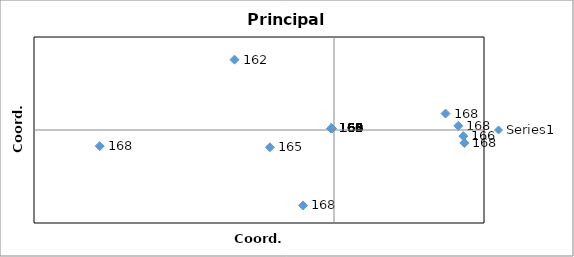
| Category | Series 0 |
|---|---|
| 0.8693510468851741 | -0.083 |
| 0.8625037532989059 | -0.04 |
| 0.8290828827029942 | 0.027 |
| 0.7436455254052227 | 0.106 |
| -0.20622155248945861 | -0.487 |
| -0.4272006790853172 | -0.112 |
| -0.662946236337818 | 0.454 |
| -1.5619629406298896 | -0.104 |
| -0.018593824989577994 | 0.01 |
| -0.018593824989597767 | 0.01 |
| -0.01859382498960576 | 0.01 |
| -0.018593824989621498 | 0.01 |
| -0.018593824989633582 | 0.01 |
| -0.018593824989645083 | 0.01 |
| -0.018593824989655994 | 0.01 |
| -0.018593824989666424 | 0.01 |
| -0.018593824989676336 | 0.01 |
| -0.018593824989685738 | 0.01 |
| -0.018593824989694696 | 0.01 |
| -0.018593824989703266 | 0.01 |
| -0.01859382498971471 | 0.01 |
| -0.018593824989723076 | 0.01 |
| -0.01859382498973114 | 0.01 |
| -0.018593824989738963 | 0.01 |
| -0.018593824989746516 | 0.01 |
| -0.01859382498959726 | 0.01 |
| -0.018593824989597232 | 0.01 |
| -0.01859382498959718 | 0.01 |
| -0.018593824989597156 | 0.01 |
| -0.01859382498959712 | 0.01 |
| -0.018593824989595505 | 0.01 |
| -0.018593824989595505 | 0.01 |